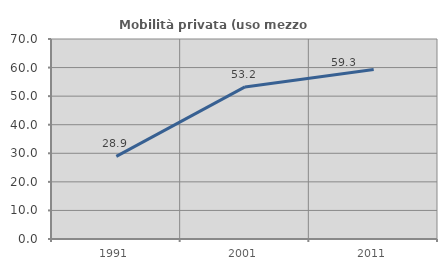
| Category | Mobilità privata (uso mezzo privato) |
|---|---|
| 1991.0 | 28.921 |
| 2001.0 | 53.237 |
| 2011.0 | 59.343 |